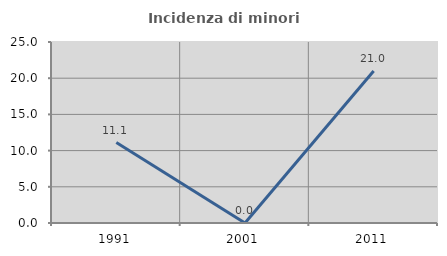
| Category | Incidenza di minori stranieri |
|---|---|
| 1991.0 | 11.111 |
| 2001.0 | 0 |
| 2011.0 | 20.994 |